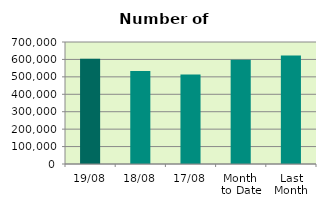
| Category | Series 0 |
|---|---|
| 19/08 | 604164 |
| 18/08 | 533810 |
| 17/08 | 513502 |
| Month 
to Date | 598468 |
| Last
Month | 622411.826 |